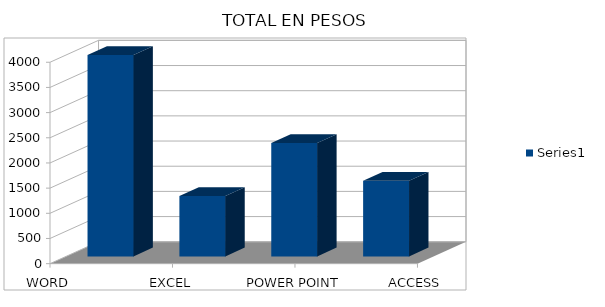
| Category | Series 0 |
|---|---|
| WORD | 4000 |
| EXCEL | 1200 |
| POWER POINT | 2250 |
| ACCESS | 1500 |